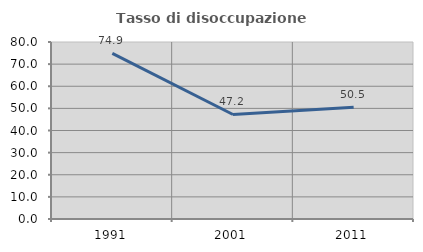
| Category | Tasso di disoccupazione giovanile  |
|---|---|
| 1991.0 | 74.869 |
| 2001.0 | 47.239 |
| 2011.0 | 50.549 |